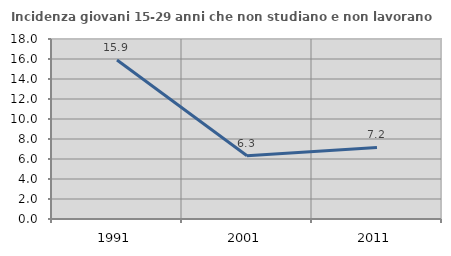
| Category | Incidenza giovani 15-29 anni che non studiano e non lavorano  |
|---|---|
| 1991.0 | 15.903 |
| 2001.0 | 6.332 |
| 2011.0 | 7.16 |